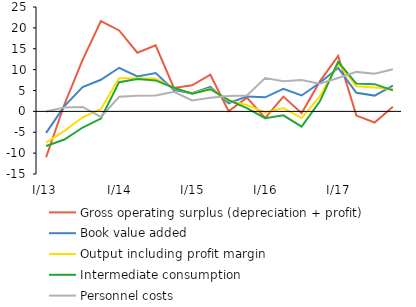
| Category | Gross operating surplus (depreciation + profit) | Book value added | Output including profit margin | Intermediate consumption | Personnel costs |
|---|---|---|---|---|---|
| I/13 | -10.985 | -5.139 | -7.467 | -8.299 | -0.029 |
| II | 1.651 | 1.266 | -4.677 | -6.746 | 0.952 |
| III | 12.354 | 5.83 | -1.408 | -3.867 | 1.073 |
| IV | 21.633 | 7.569 | 0.561 | -1.724 | -1.317 |
|  I/14 | 19.377 | 10.443 | 7.927 | 6.996 | 3.489 |
| II | 14.056 | 8.377 | 7.929 | 7.759 | 3.715 |
| III | 15.807 | 9.164 | 7.897 | 7.423 | 3.778 |
| IV | 5.608 | 5.099 | 5.518 | 5.667 | 4.703 |
|  I/15 | 6.258 | 4.33 | 4.267 | 4.242 | 2.6 |
|  II | 8.779 | 5.885 | 5.463 | 5.302 | 3.274 |
| III | 0.02 | 1.943 | 2.472 | 2.674 | 3.683 |
| IV | 3.287 | 3.585 | 1.515 | 0.78 | 3.819 |
|  I/16 | -1.596 | 3.373 | -0.248 | -1.632 | 7.994 |
| II | 3.541 | 5.412 | 0.805 | -0.957 | 7.192 |
| III | -0.43 | 3.809 | -1.61 | -3.654 | 7.507 |
| IV | 7.176 | 6.856 | 3.599 | 2.411 | 6.605 |
|  I/17 | 13.273 | 10.409 | 11.463 | 11.886 | 7.982 |
| II | -1.012 | 4.445 | 6.009 | 6.646 | 9.458 |
| III | -2.678 | 3.78 | 5.728 | 6.519 | 9 |
| IV | 1.133 | 6.149 | 5.336 | 5.027 | 10.09 |